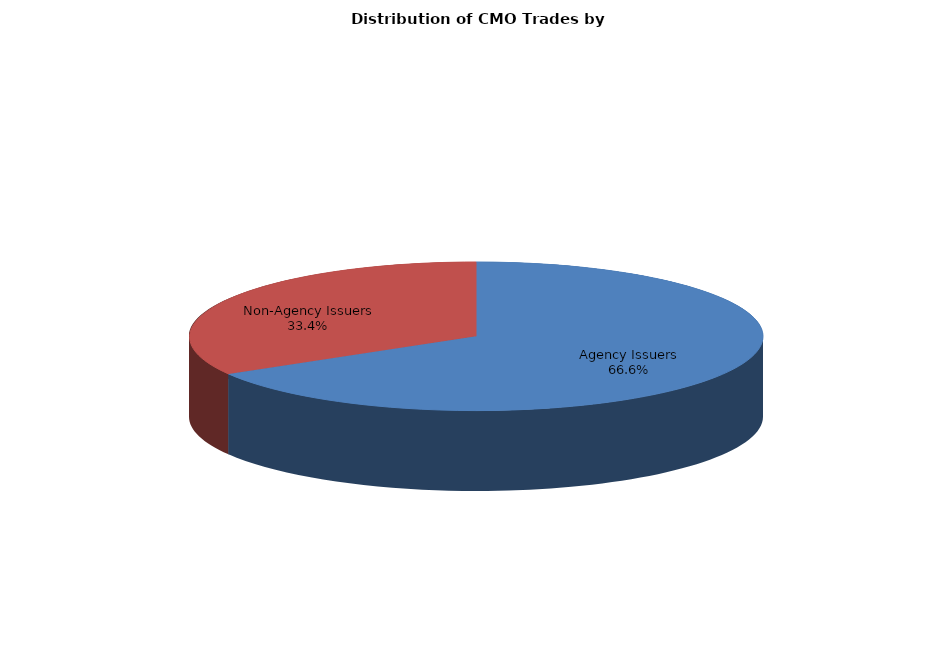
| Category | Series 0 |
|---|---|
| Agency Issuers | 741.648 |
| Non-Agency Issuers | 372.728 |